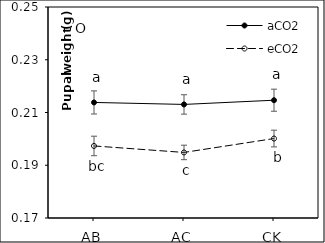
| Category | aCO2 | eCO2 |
|---|---|---|
| AB | 0.214 | 0.197 |
| AC | 0.213 | 0.195 |
| CK | 0.215 | 0.2 |